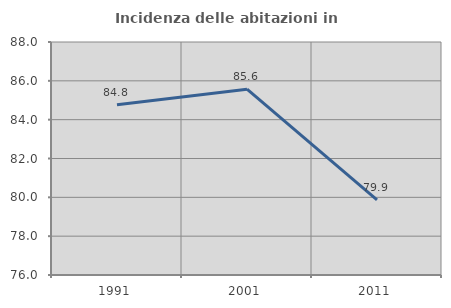
| Category | Incidenza delle abitazioni in proprietà  |
|---|---|
| 1991.0 | 84.766 |
| 2001.0 | 85.57 |
| 2011.0 | 79.872 |